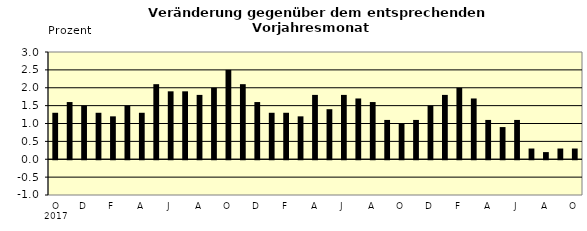
| Category | Series 0 |
|---|---|
| 0 | 1.3 |
| 1 | 1.6 |
| 2 | 1.5 |
| 3 | 1.3 |
| 4 | 1.2 |
| 5 | 1.5 |
| 6 | 1.3 |
| 7 | 2.1 |
| 8 | 1.9 |
| 9 | 1.9 |
| 10 | 1.8 |
| 11 | 2 |
| 12 | 2.5 |
| 13 | 2.1 |
| 14 | 1.6 |
| 15 | 1.3 |
| 16 | 1.3 |
| 17 | 1.2 |
| 18 | 1.8 |
| 19 | 1.4 |
| 20 | 1.8 |
| 21 | 1.7 |
| 22 | 1.6 |
| 23 | 1.1 |
| 24 | 1 |
| 25 | 1.1 |
| 26 | 1.5 |
| 27 | 1.8 |
| 28 | 2 |
| 29 | 1.7 |
| 30 | 1.1 |
| 31 | 0.9 |
| 32 | 1.1 |
| 33 | 0.3 |
| 34 | 0.2 |
| 35 | 0.3 |
| 36 | 0.3 |